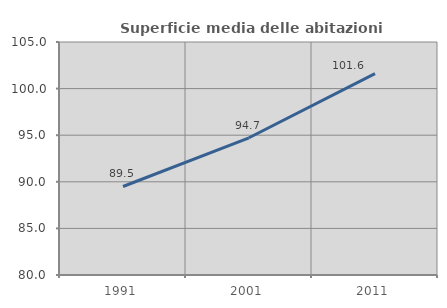
| Category | Superficie media delle abitazioni occupate |
|---|---|
| 1991.0 | 89.497 |
| 2001.0 | 94.723 |
| 2011.0 | 101.607 |